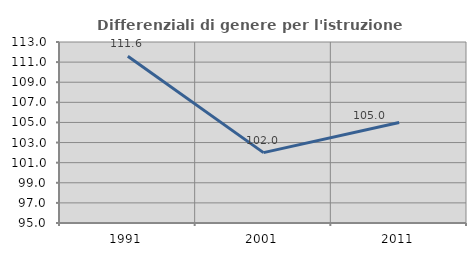
| Category | Differenziali di genere per l'istruzione superiore |
|---|---|
| 1991.0 | 111.58 |
| 2001.0 | 101.998 |
| 2011.0 | 104.999 |